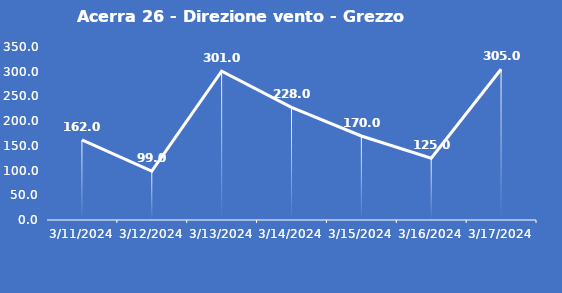
| Category | Acerra 26 - Direzione vento - Grezzo (°N) |
|---|---|
| 3/11/24 | 162 |
| 3/12/24 | 99 |
| 3/13/24 | 301 |
| 3/14/24 | 228 |
| 3/15/24 | 170 |
| 3/16/24 | 125 |
| 3/17/24 | 305 |